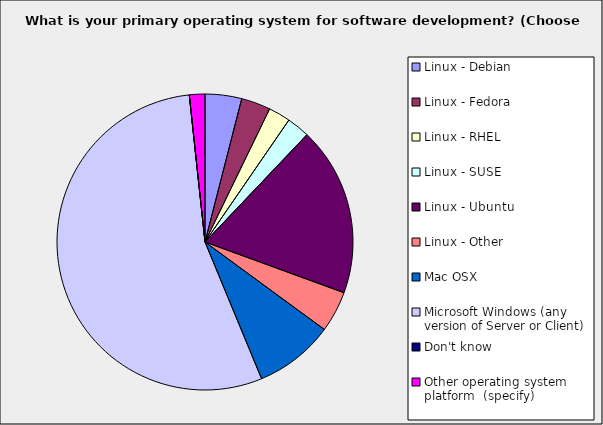
| Category | Series 0 |
|---|---|
| Linux - Debian | 0.04 |
| Linux - Fedora | 0.032 |
| Linux - RHEL | 0.024 |
| Linux - SUSE | 0.025 |
| Linux - Ubuntu | 0.185 |
| Linux - Other | 0.045 |
| Mac OSX | 0.087 |
| Microsoft Windows (any version of Server or Client) | 0.546 |
| Don't know | 0 |
| Other operating system platform  (specify) | 0.017 |